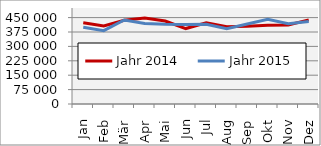
| Category | Jahr 2014 | Jahr 2015 |
|---|---|---|
| Jan | 423665.48 | 399737.309 |
| Feb | 406809.705 | 382169.486 |
| Mär | 436373.395 | 437449.44 |
| Apr | 448021.278 | 419868.178 |
| Mai | 431886.856 | 414775.66 |
| Jun | 392892.355 | 414585.405 |
| Jul | 423201.872 | 415685.431 |
| Aug | 401955.888 | 392666.254 |
| Sep | 405564.151 | 416214.627 |
| Okt | 410027.409 | 441440.462 |
| Nov | 411238.112 | 418325.634 |
| Dez | 438118.857 | 429240.595 |